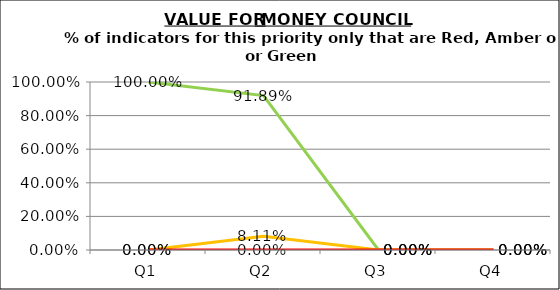
| Category | Green | Amber | Red |
|---|---|---|---|
| Q1 | 1 | 0 | 0 |
| Q2 | 0.919 | 0.081 | 0 |
| Q3 | 0 | 0 | 0 |
| Q4 | 0 | 0 | 0 |